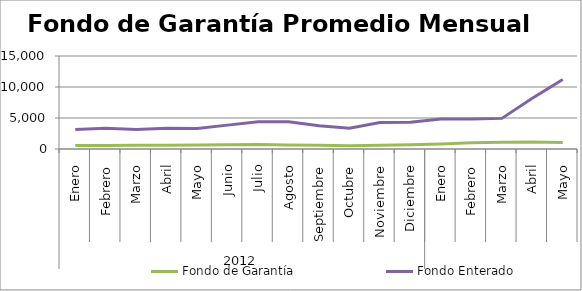
| Category | Fondo de Garantía | Fondo Enterado |
|---|---|---|
| 0 | 560.173 | 3141.641 |
| 1 | 575.916 | 3362.648 |
| 2 | 622.075 | 3154.118 |
| 3 | 612.299 | 3348.058 |
| 4 | 654.277 | 3308.859 |
| 5 | 675.965 | 3850.375 |
| 6 | 729.97 | 4400.539 |
| 7 | 649.095 | 4383.327 |
| 8 | 606.03 | 3757.632 |
| 9 | 525.314 | 3362.932 |
| 10 | 591.646 | 4285.609 |
| 11 | 703.403 | 4296.87 |
| 12 | 823.344 | 4842.786 |
| 13 | 1008.855 | 4845.136 |
| 14 | 1091.101 | 4938.365 |
| 15 | 1128.09 | 8179.666 |
| 16 | 1047.818 | 11202.213 |